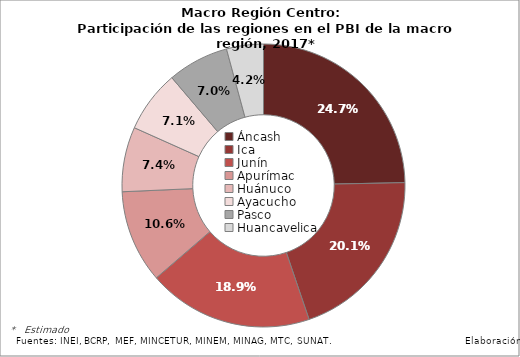
| Category | Series 0 |
|---|---|
| Áncash | 0.247 |
| Ica | 0.201 |
| Junín | 0.189 |
| Apurímac | 0.106 |
| Huánuco | 0.074 |
| Ayacucho | 0.071 |
| Pasco | 0.07 |
| Huancavelica | 0.042 |